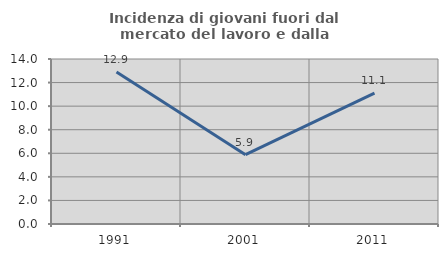
| Category | Incidenza di giovani fuori dal mercato del lavoro e dalla formazione  |
|---|---|
| 1991.0 | 12.903 |
| 2001.0 | 5.882 |
| 2011.0 | 11.111 |